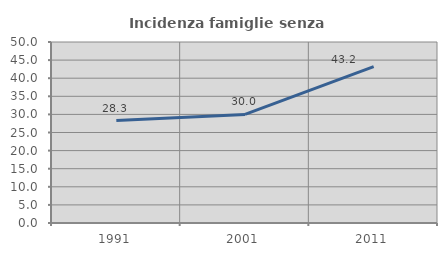
| Category | Incidenza famiglie senza nuclei |
|---|---|
| 1991.0 | 28.314 |
| 2001.0 | 30 |
| 2011.0 | 43.196 |